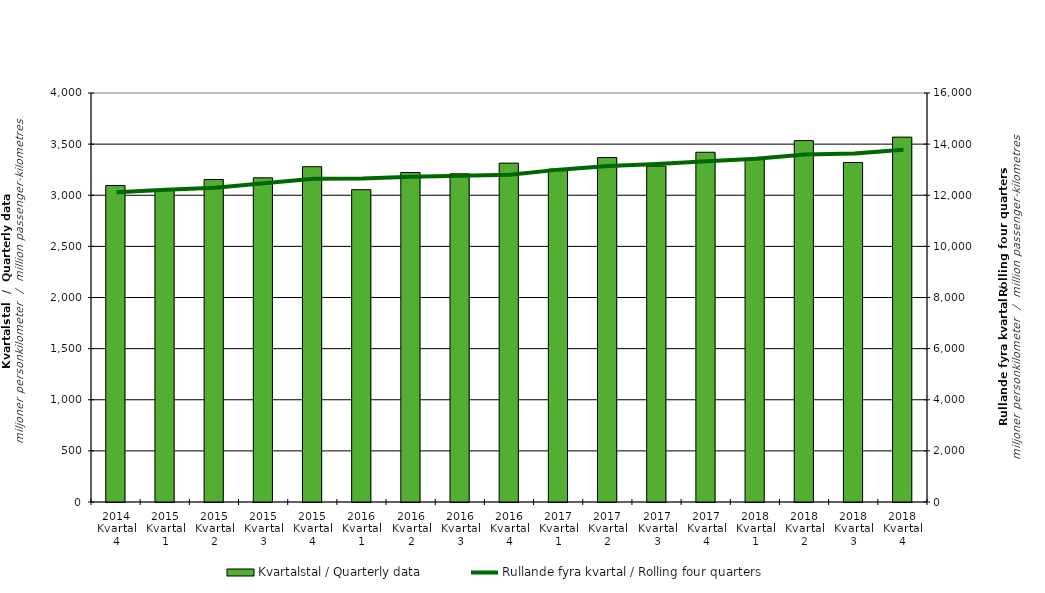
| Category | Kvartalstal / Quarterly data |
|---|---|
| 2014 Kvartal 4 | 3095.522 |
| 2015 Kvartal 1 | 3046.219 |
| 2015 Kvartal 2 | 3154.23 |
| 2015 Kvartal 3 | 3170.433 |
| 2015 Kvartal 4 | 3279.061 |
| 2016 Kvartal 1 | 3054.329 |
| 2016 Kvartal 2 | 3222.51 |
| 2016 Kvartal 3 | 3209.228 |
| 2016 Kvartal 4 | 3314.245 |
| 2017 Kvartal 1 | 3256.102 |
| 2017 Kvartal 2 | 3368.63 |
| 2017 Kvartal 3 | 3285.241 |
| 2017 Kvartal 4 | 3420.641 |
| 2018 Kvartal 1 | 3354.787 |
| 2018 Kvartal 2 | 3534.212 |
| 2018 Kvartal 3 | 3320.24 |
| 2018 Kvartal 4 | 3568.507 |